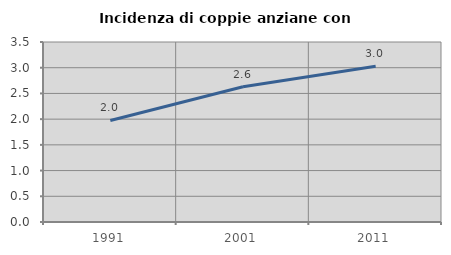
| Category | Incidenza di coppie anziane con figli |
|---|---|
| 1991.0 | 1.975 |
| 2001.0 | 2.631 |
| 2011.0 | 3.027 |